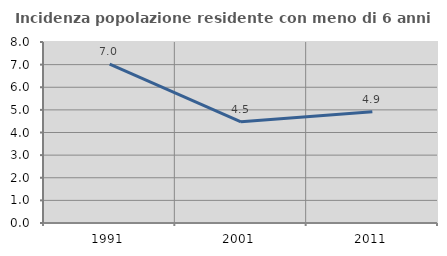
| Category | Incidenza popolazione residente con meno di 6 anni |
|---|---|
| 1991.0 | 7.018 |
| 2001.0 | 4.47 |
| 2011.0 | 4.922 |